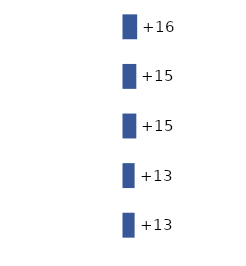
| Category | Series 0 |
|---|---|
| 0 | 16 |
| 1 | 15 |
| 2 | 15 |
| 3 | 13 |
| 4 | 13 |